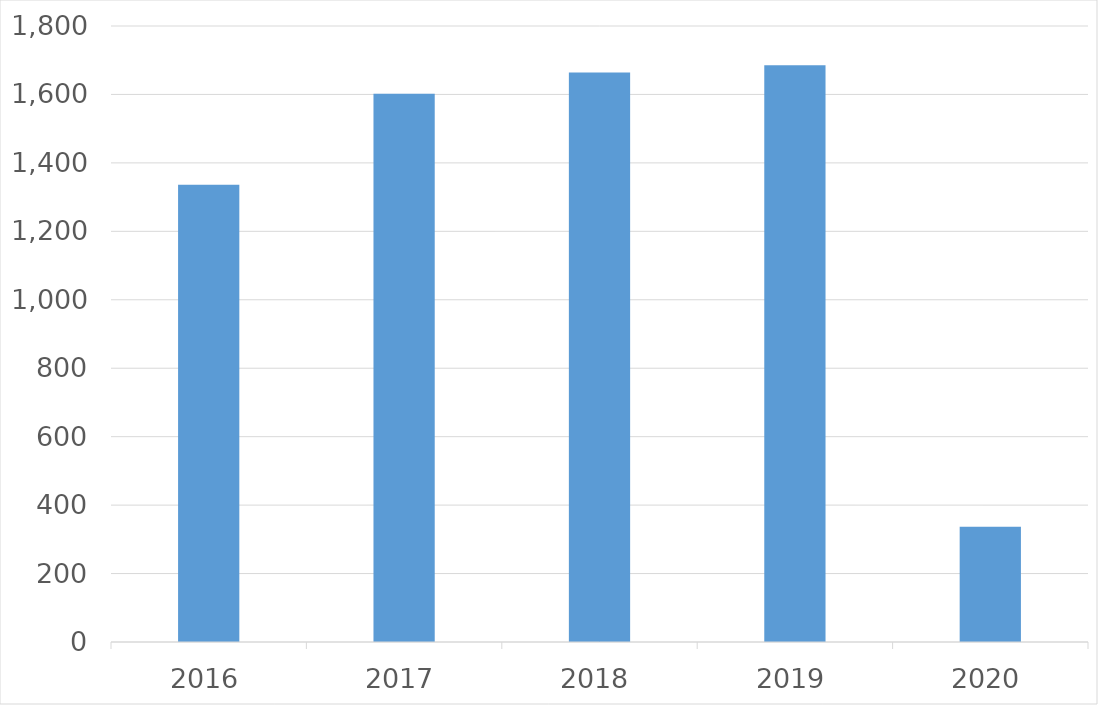
| Category | Series 0 |
|---|---|
| 2016 | 1336 |
| 2017 | 1602 |
| 2018 | 1664 |
| 2019 | 1685 |
| 2020 | 337 |